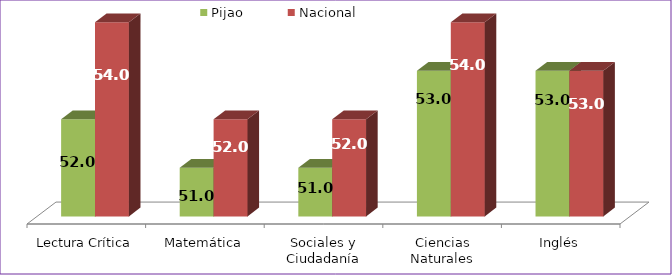
| Category | Pijao | Nacional |
|---|---|---|
| Lectura Crítica | 52 | 54 |
| Matemática | 51 | 52 |
| Sociales y Ciudadanía | 51 | 52 |
| Ciencias Naturales | 53 | 54 |
| Inglés | 53 | 53 |